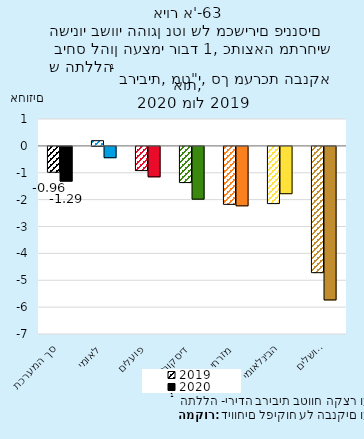
| Category | 2019 | 2020 |
|---|---|---|
| סך המערכת | -0.963 | -1.292 |
| לאומי | 0.193 | -0.422 |
| פועלים | -0.901 | -1.133 |
| דיסקונט | -1.347 | -1.964 |
| מזרחי | -2.158 | -2.212 |
| הבינלאומי | -2.129 | -1.761 |
| ירושלים | -4.699 | -5.713 |